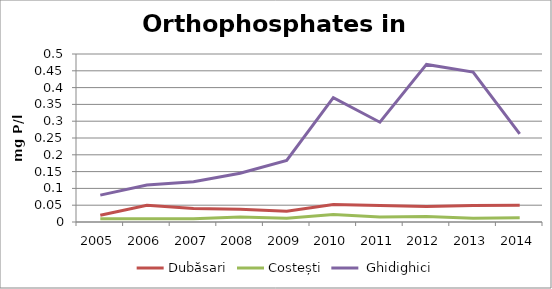
| Category | Dubăsari | Costești |  Ghidighici |
|---|---|---|---|
| 2005.0 | 0.02 | 0.01 | 0.08 |
| 2006.0 | 0.05 | 0.01 | 0.11 |
| 2007.0 | 0.04 | 0.01 | 0.12 |
| 2008.0 | 0.038 | 0.015 | 0.145 |
| 2009.0 | 0.032 | 0.011 | 0.183 |
| 2010.0 | 0.052 | 0.022 | 0.37 |
| 2011.0 | 0.049 | 0.015 | 0.297 |
| 2012.0 | 0.046 | 0.016 | 0.469 |
| 2013.0 | 0.049 | 0.011 | 0.446 |
| 2014.0 | 0.05 | 0.013 | 0.262 |